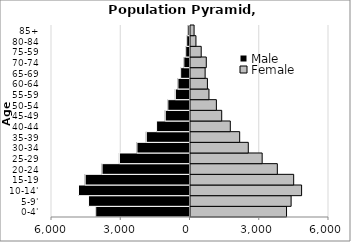
| Category | Male | Female |
|---|---|---|
| 0-4' | -4084.82 | 4160.69 |
| 5-9' | -4395.2 | 4359.15 |
| 10-14' | -4830.51 | 4812.75 |
| 15-19 | -4541.42 | 4469.68 |
| 20-24 | -3809.61 | 3762.08 |
| 25-29 | -3058.21 | 3104.41 |
| 30-34 | -2298.21 | 2503.23 |
| 35-39 | -1893.12 | 2130.44 |
| 40-44 | -1448.24 | 1724.19 |
| 45-49 | -1071.97 | 1351.87 |
| 50-54 | -960 | 1121.22 |
| 55-59 | -634.5 | 799.46 |
| 60-64 | -523.81 | 732.49 |
| 65-69 | -405.21 | 633.64 |
| 70-74 | -267.74 | 683.81 |
| 75-59 | -186.13 | 463.81 |
| 80-84 | -143.16 | 236.02 |
| 85+ | -93.91 | 155.23 |